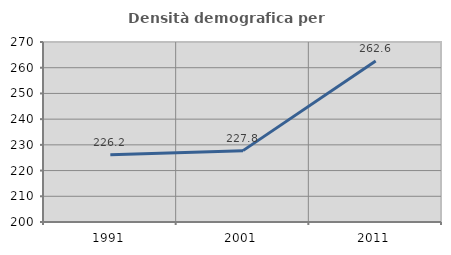
| Category | Densità demografica |
|---|---|
| 1991.0 | 226.152 |
| 2001.0 | 227.755 |
| 2011.0 | 262.62 |